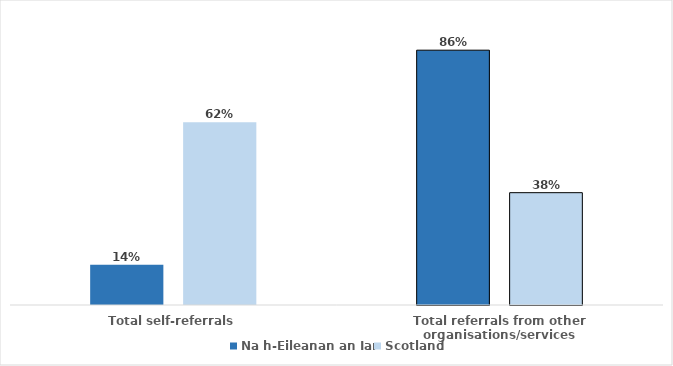
| Category | Na h-Eileanan an Iar | Scotland |
|---|---|---|
| Total self-referrals | 0.136 | 0.619 |
| Total referrals from other organisations/services | 0.864 | 0.381 |